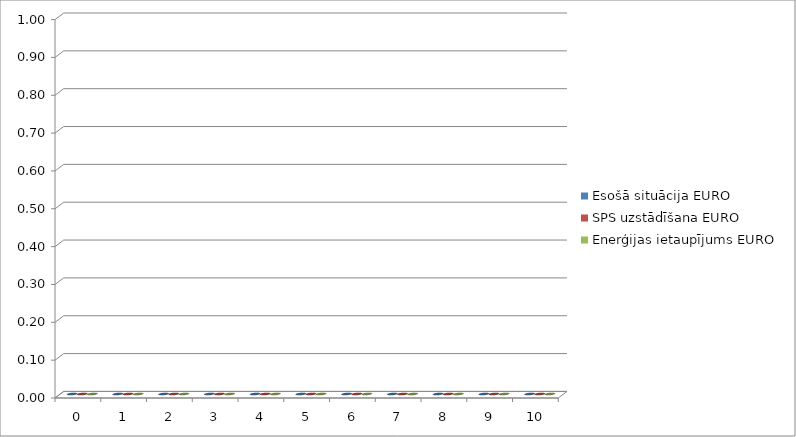
| Category | Esošā situācija EURO | SPS uzstādīšana EURO | Enerģijas ietaupījums EURO |
|---|---|---|---|
| 0.0 | 0 | 0 | 0 |
| 1.0 | 0 | 0 | 0 |
| 2.0 | 0 | 0 | 0 |
| 3.0 | 0 | 0 | 0 |
| 4.0 | 0 | 0 | 0 |
| 5.0 | 0 | 0 | 0 |
| 6.0 | 0 | 0 | 0 |
| 7.0 | 0 | 0 | 0 |
| 8.0 | 0 | 0 | 0 |
| 9.0 | 0 | 0 | 0 |
| 10.0 | 0 | 0 | 0 |